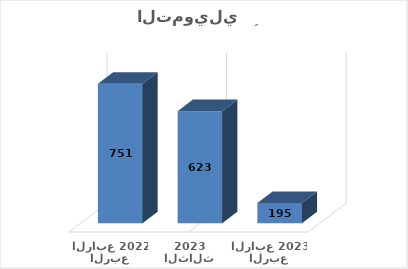
| Category | Series 0 |
|---|---|
| الربع الرابع 2023 | 195 |
| الربع الثالث  2023 | 623 |
| الربع الرابع 2022 | 751 |